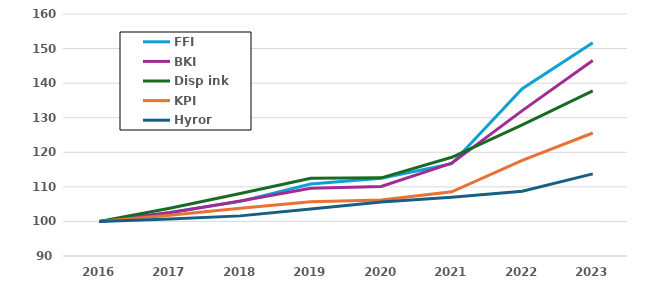
| Category | FFI | BKI | Disp ink | KPI | Hyror |
|---|---|---|---|---|---|
| 2016.0 | 100 | 100 | 100 | 100 | 100 |
| 2017.0 | 102.6 | 102.5 | 103.8 | 101.8 | 100.7 |
| 2018.0 | 105.8 | 105.882 | 108.056 | 103.836 | 101.606 |
| 2019.0 | 110.8 | 109.588 | 112.486 | 105.705 | 103.588 |
| 2020.0 | 112.5 | 110.136 | 112.599 | 106.234 | 105.608 |
| 2021.0 | 116.7 | 116.855 | 118.566 | 108.571 | 106.98 |
| 2022.0 | 138.4 | 132.046 | 127.933 | 117.691 | 108.746 |
| 2023.0 | 151.686 | 146.571 | 137.784 | 125.576 | 113.748 |